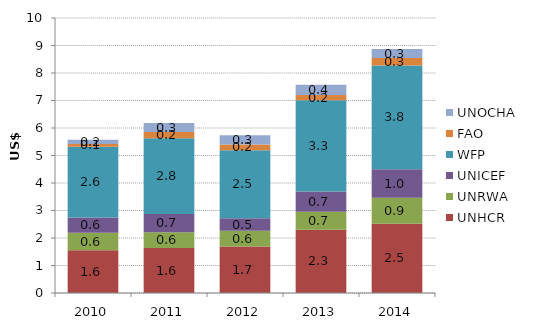
| Category | UNHCR | UNRWA | UNICEF | WFP | FAO | UNOCHA |
|---|---|---|---|---|---|---|
| 2010.0 | 1553.188 | 635.627 | 560.583 | 2569.536 | 95.81 | 161.375 |
| 2011.0 | 1633.968 | 578.466 | 656.924 | 2758.603 | 222.254 | 327.926 |
| 2012.0 | 1695.294 | 564.874 | 457.594 | 2477.652 | 206.597 | 335.671 |
| 2013.0 | 2296.455 | 661.822 | 736.904 | 3311.889 | 196.037 | 366.879 |
| 2014.0 | 2517.281 | 941.925 | 1043.475 | 3767.928 | 275.134 | 325.833 |